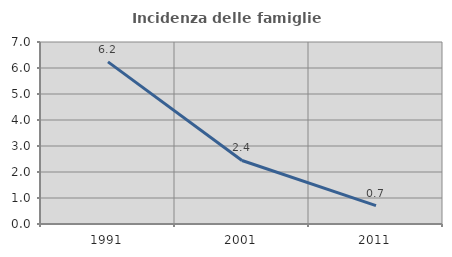
| Category | Incidenza delle famiglie numerose |
|---|---|
| 1991.0 | 6.236 |
| 2001.0 | 2.444 |
| 2011.0 | 0.704 |